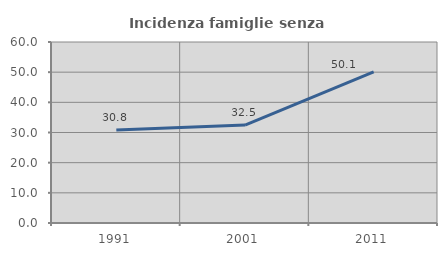
| Category | Incidenza famiglie senza nuclei |
|---|---|
| 1991.0 | 30.833 |
| 2001.0 | 32.468 |
| 2011.0 | 50.099 |